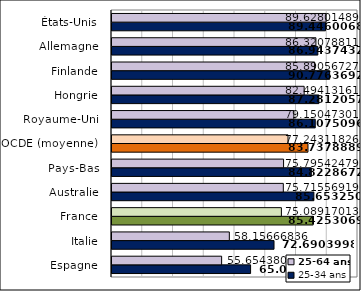
| Category | 25-34 ans | 25-64 ans |
|---|---|---|
| Espagne | 65.07 | 55.654 |
| Italie | 72.69 | 58.157 |
| France | 85.425 | 75.089 |
| Australie | 85.653 | 75.716 |
| Pays-Bas | 84.823 | 75.795 |
| OCDE (moyenne) | 83.738 | 77.243 |
| Royaume-Uni | 86.108 | 79.15 |
| Hongrie | 87.281 | 82.494 |
| Finlande | 90.776 | 85.891 |
| Allemagne | 86.944 | 86.321 |
| États-Unis | 89.446 | 89.628 |